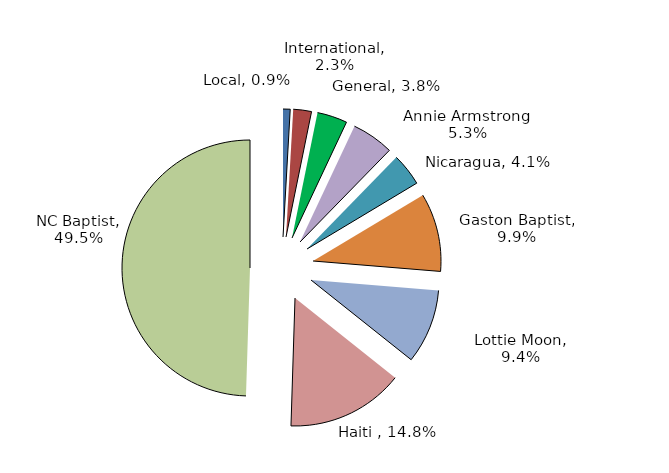
| Category | Percentage | Missions |
|---|---|---|
| Local | 0.009 | 0 |
| International | 0.023 | 0 |
| General | 0.038 | 0 |
| Annie Armstrong | 0.053 | 0 |
| Nicaragua | 0.041 | 0 |
| Gaston Baptist | 0.099 | 0 |
| Lottie Moon | 0.094 | 0 |
| Haiti  | 0.148 | 0 |
| NC Baptist | 0.495 | 0 |